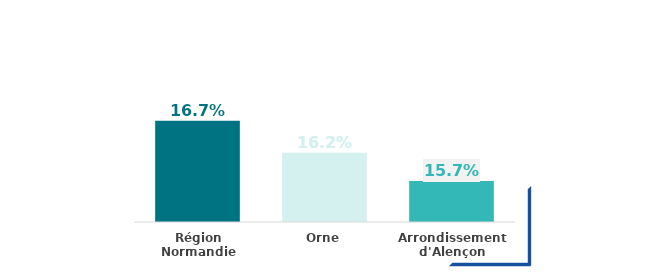
| Category | Series 0 |
|---|---|
| Région Normandie | 0.167 |
| Orne | 0.162 |
| Arrondissement d'Alençon | 0.157 |